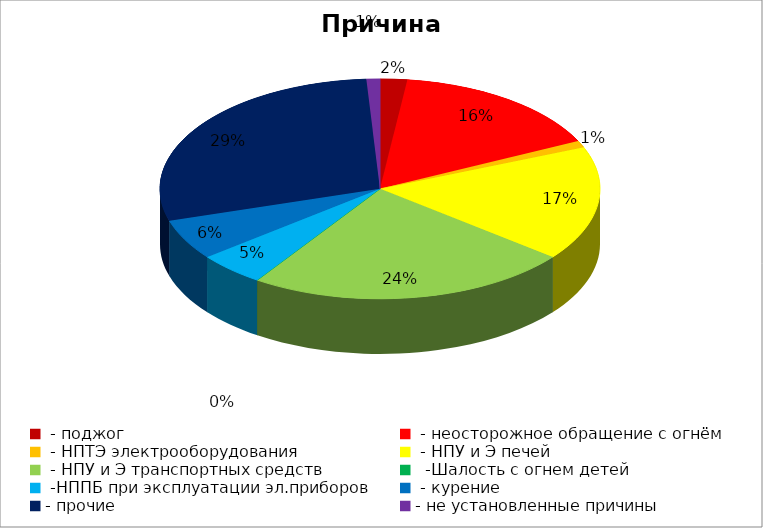
| Category | Причина пожара |
|---|---|
|  - поджог | 2 |
|  - неосторожное обращение с огнём | 16 |
|  - НПТЭ электрооборудования | 1 |
|  - НПУ и Э печей | 17 |
|  - НПУ и Э транспортных средств | 24 |
|   -Шалость с огнем детей | 0 |
|  -НППБ при эксплуатации эл.приборов | 5 |
|  - курение | 6 |
| - прочие | 29 |
| - не установленные причины | 1 |